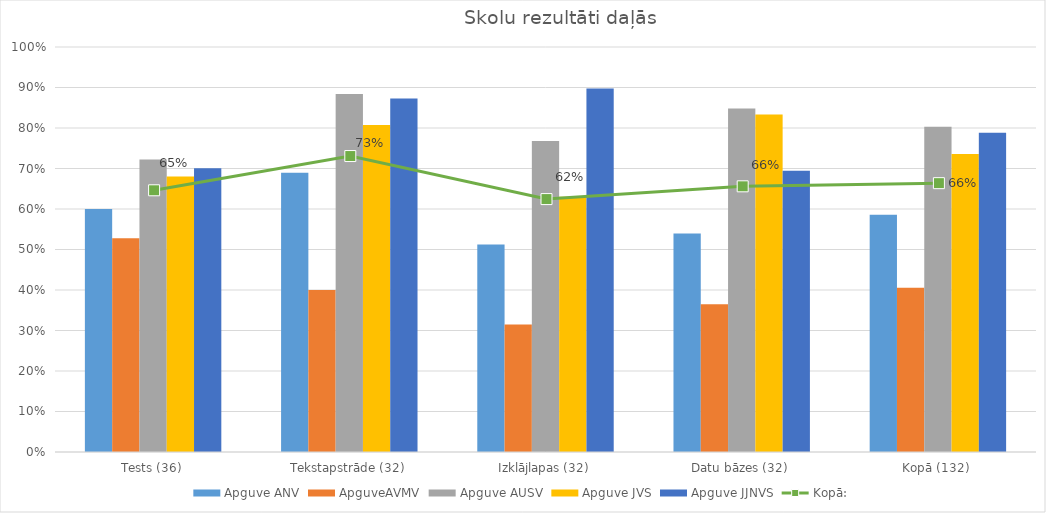
| Category | Apguve ANV | ApguveAVMV | Apguve AUSV | Apguve JVS | Apguve JJNVS |
|---|---|---|---|---|---|
| Tests (36) | 0.6 | 0.528 | 0.722 | 0.681 | 0.7 |
| Tekstapstrāde (32) | 0.69 | 0.4 | 0.884 | 0.807 | 0.873 |
| Izklājlapas (32) | 0.512 | 0.315 | 0.768 | 0.63 | 0.897 |
| Datu bāzes (32) | 0.54 | 0.365 | 0.848 | 0.833 | 0.694 |
| Kopā (132) | 0.586 | 0.406 | 0.803 | 0.736 | 0.788 |